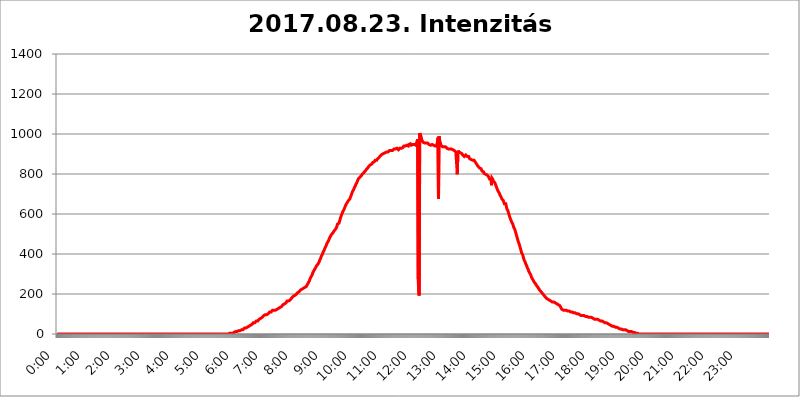
| Category | 2017.08.23. Intenzitás [W/m^2] |
|---|---|
| 0.0 | 0 |
| 0.0006944444444444445 | 0 |
| 0.001388888888888889 | 0 |
| 0.0020833333333333333 | 0 |
| 0.002777777777777778 | 0 |
| 0.003472222222222222 | 0 |
| 0.004166666666666667 | 0 |
| 0.004861111111111111 | 0 |
| 0.005555555555555556 | 0 |
| 0.0062499999999999995 | 0 |
| 0.006944444444444444 | 0 |
| 0.007638888888888889 | 0 |
| 0.008333333333333333 | 0 |
| 0.009027777777777779 | 0 |
| 0.009722222222222222 | 0 |
| 0.010416666666666666 | 0 |
| 0.011111111111111112 | 0 |
| 0.011805555555555555 | 0 |
| 0.012499999999999999 | 0 |
| 0.013194444444444444 | 0 |
| 0.013888888888888888 | 0 |
| 0.014583333333333332 | 0 |
| 0.015277777777777777 | 0 |
| 0.015972222222222224 | 0 |
| 0.016666666666666666 | 0 |
| 0.017361111111111112 | 0 |
| 0.018055555555555557 | 0 |
| 0.01875 | 0 |
| 0.019444444444444445 | 0 |
| 0.02013888888888889 | 0 |
| 0.020833333333333332 | 0 |
| 0.02152777777777778 | 0 |
| 0.022222222222222223 | 0 |
| 0.02291666666666667 | 0 |
| 0.02361111111111111 | 0 |
| 0.024305555555555556 | 0 |
| 0.024999999999999998 | 0 |
| 0.025694444444444447 | 0 |
| 0.02638888888888889 | 0 |
| 0.027083333333333334 | 0 |
| 0.027777777777777776 | 0 |
| 0.02847222222222222 | 0 |
| 0.029166666666666664 | 0 |
| 0.029861111111111113 | 0 |
| 0.030555555555555555 | 0 |
| 0.03125 | 0 |
| 0.03194444444444445 | 0 |
| 0.03263888888888889 | 0 |
| 0.03333333333333333 | 0 |
| 0.034027777777777775 | 0 |
| 0.034722222222222224 | 0 |
| 0.035416666666666666 | 0 |
| 0.036111111111111115 | 0 |
| 0.03680555555555556 | 0 |
| 0.0375 | 0 |
| 0.03819444444444444 | 0 |
| 0.03888888888888889 | 0 |
| 0.03958333333333333 | 0 |
| 0.04027777777777778 | 0 |
| 0.04097222222222222 | 0 |
| 0.041666666666666664 | 0 |
| 0.042361111111111106 | 0 |
| 0.04305555555555556 | 0 |
| 0.043750000000000004 | 0 |
| 0.044444444444444446 | 0 |
| 0.04513888888888889 | 0 |
| 0.04583333333333334 | 0 |
| 0.04652777777777778 | 0 |
| 0.04722222222222222 | 0 |
| 0.04791666666666666 | 0 |
| 0.04861111111111111 | 0 |
| 0.049305555555555554 | 0 |
| 0.049999999999999996 | 0 |
| 0.05069444444444445 | 0 |
| 0.051388888888888894 | 0 |
| 0.052083333333333336 | 0 |
| 0.05277777777777778 | 0 |
| 0.05347222222222222 | 0 |
| 0.05416666666666667 | 0 |
| 0.05486111111111111 | 0 |
| 0.05555555555555555 | 0 |
| 0.05625 | 0 |
| 0.05694444444444444 | 0 |
| 0.057638888888888885 | 0 |
| 0.05833333333333333 | 0 |
| 0.05902777777777778 | 0 |
| 0.059722222222222225 | 0 |
| 0.06041666666666667 | 0 |
| 0.061111111111111116 | 0 |
| 0.06180555555555556 | 0 |
| 0.0625 | 0 |
| 0.06319444444444444 | 0 |
| 0.06388888888888888 | 0 |
| 0.06458333333333334 | 0 |
| 0.06527777777777778 | 0 |
| 0.06597222222222222 | 0 |
| 0.06666666666666667 | 0 |
| 0.06736111111111111 | 0 |
| 0.06805555555555555 | 0 |
| 0.06874999999999999 | 0 |
| 0.06944444444444443 | 0 |
| 0.07013888888888889 | 0 |
| 0.07083333333333333 | 0 |
| 0.07152777777777779 | 0 |
| 0.07222222222222223 | 0 |
| 0.07291666666666667 | 0 |
| 0.07361111111111111 | 0 |
| 0.07430555555555556 | 0 |
| 0.075 | 0 |
| 0.07569444444444444 | 0 |
| 0.0763888888888889 | 0 |
| 0.07708333333333334 | 0 |
| 0.07777777777777778 | 0 |
| 0.07847222222222222 | 0 |
| 0.07916666666666666 | 0 |
| 0.0798611111111111 | 0 |
| 0.08055555555555556 | 0 |
| 0.08125 | 0 |
| 0.08194444444444444 | 0 |
| 0.08263888888888889 | 0 |
| 0.08333333333333333 | 0 |
| 0.08402777777777777 | 0 |
| 0.08472222222222221 | 0 |
| 0.08541666666666665 | 0 |
| 0.08611111111111112 | 0 |
| 0.08680555555555557 | 0 |
| 0.08750000000000001 | 0 |
| 0.08819444444444445 | 0 |
| 0.08888888888888889 | 0 |
| 0.08958333333333333 | 0 |
| 0.09027777777777778 | 0 |
| 0.09097222222222222 | 0 |
| 0.09166666666666667 | 0 |
| 0.09236111111111112 | 0 |
| 0.09305555555555556 | 0 |
| 0.09375 | 0 |
| 0.09444444444444444 | 0 |
| 0.09513888888888888 | 0 |
| 0.09583333333333333 | 0 |
| 0.09652777777777777 | 0 |
| 0.09722222222222222 | 0 |
| 0.09791666666666667 | 0 |
| 0.09861111111111111 | 0 |
| 0.09930555555555555 | 0 |
| 0.09999999999999999 | 0 |
| 0.10069444444444443 | 0 |
| 0.1013888888888889 | 0 |
| 0.10208333333333335 | 0 |
| 0.10277777777777779 | 0 |
| 0.10347222222222223 | 0 |
| 0.10416666666666667 | 0 |
| 0.10486111111111111 | 0 |
| 0.10555555555555556 | 0 |
| 0.10625 | 0 |
| 0.10694444444444444 | 0 |
| 0.1076388888888889 | 0 |
| 0.10833333333333334 | 0 |
| 0.10902777777777778 | 0 |
| 0.10972222222222222 | 0 |
| 0.1111111111111111 | 0 |
| 0.11180555555555556 | 0 |
| 0.11180555555555556 | 0 |
| 0.1125 | 0 |
| 0.11319444444444444 | 0 |
| 0.11388888888888889 | 0 |
| 0.11458333333333333 | 0 |
| 0.11527777777777777 | 0 |
| 0.11597222222222221 | 0 |
| 0.11666666666666665 | 0 |
| 0.1173611111111111 | 0 |
| 0.11805555555555557 | 0 |
| 0.11944444444444445 | 0 |
| 0.12013888888888889 | 0 |
| 0.12083333333333333 | 0 |
| 0.12152777777777778 | 0 |
| 0.12222222222222223 | 0 |
| 0.12291666666666667 | 0 |
| 0.12291666666666667 | 0 |
| 0.12361111111111112 | 0 |
| 0.12430555555555556 | 0 |
| 0.125 | 0 |
| 0.12569444444444444 | 0 |
| 0.12638888888888888 | 0 |
| 0.12708333333333333 | 0 |
| 0.16875 | 0 |
| 0.12847222222222224 | 0 |
| 0.12916666666666668 | 0 |
| 0.12986111111111112 | 0 |
| 0.13055555555555556 | 0 |
| 0.13125 | 0 |
| 0.13194444444444445 | 0 |
| 0.1326388888888889 | 0 |
| 0.13333333333333333 | 0 |
| 0.13402777777777777 | 0 |
| 0.13402777777777777 | 0 |
| 0.13472222222222222 | 0 |
| 0.13541666666666666 | 0 |
| 0.1361111111111111 | 0 |
| 0.13749999999999998 | 0 |
| 0.13819444444444443 | 0 |
| 0.1388888888888889 | 0 |
| 0.13958333333333334 | 0 |
| 0.14027777777777778 | 0 |
| 0.14097222222222222 | 0 |
| 0.14166666666666666 | 0 |
| 0.1423611111111111 | 0 |
| 0.14305555555555557 | 0 |
| 0.14375000000000002 | 0 |
| 0.14444444444444446 | 0 |
| 0.1451388888888889 | 0 |
| 0.1451388888888889 | 0 |
| 0.14652777777777778 | 0 |
| 0.14722222222222223 | 0 |
| 0.14791666666666667 | 0 |
| 0.1486111111111111 | 0 |
| 0.14930555555555555 | 0 |
| 0.15 | 0 |
| 0.15069444444444444 | 0 |
| 0.15138888888888888 | 0 |
| 0.15208333333333332 | 0 |
| 0.15277777777777776 | 0 |
| 0.15347222222222223 | 0 |
| 0.15416666666666667 | 0 |
| 0.15486111111111112 | 0 |
| 0.15555555555555556 | 0 |
| 0.15625 | 0 |
| 0.15694444444444444 | 0 |
| 0.15763888888888888 | 0 |
| 0.15833333333333333 | 0 |
| 0.15902777777777777 | 0 |
| 0.15972222222222224 | 0 |
| 0.16041666666666668 | 0 |
| 0.16111111111111112 | 0 |
| 0.16180555555555556 | 0 |
| 0.1625 | 0 |
| 0.16319444444444445 | 0 |
| 0.1638888888888889 | 0 |
| 0.16458333333333333 | 0 |
| 0.16527777777777777 | 0 |
| 0.16597222222222222 | 0 |
| 0.16666666666666666 | 0 |
| 0.1673611111111111 | 0 |
| 0.16805555555555554 | 0 |
| 0.16874999999999998 | 0 |
| 0.16944444444444443 | 0 |
| 0.17013888888888887 | 0 |
| 0.1708333333333333 | 0 |
| 0.17152777777777775 | 0 |
| 0.17222222222222225 | 0 |
| 0.1729166666666667 | 0 |
| 0.17361111111111113 | 0 |
| 0.17430555555555557 | 0 |
| 0.17500000000000002 | 0 |
| 0.17569444444444446 | 0 |
| 0.1763888888888889 | 0 |
| 0.17708333333333334 | 0 |
| 0.17777777777777778 | 0 |
| 0.17847222222222223 | 0 |
| 0.17916666666666667 | 0 |
| 0.1798611111111111 | 0 |
| 0.18055555555555555 | 0 |
| 0.18125 | 0 |
| 0.18194444444444444 | 0 |
| 0.1826388888888889 | 0 |
| 0.18333333333333335 | 0 |
| 0.1840277777777778 | 0 |
| 0.18472222222222223 | 0 |
| 0.18541666666666667 | 0 |
| 0.18611111111111112 | 0 |
| 0.18680555555555556 | 0 |
| 0.1875 | 0 |
| 0.18819444444444444 | 0 |
| 0.18888888888888888 | 0 |
| 0.18958333333333333 | 0 |
| 0.19027777777777777 | 0 |
| 0.1909722222222222 | 0 |
| 0.19166666666666665 | 0 |
| 0.19236111111111112 | 0 |
| 0.19305555555555554 | 0 |
| 0.19375 | 0 |
| 0.19444444444444445 | 0 |
| 0.1951388888888889 | 0 |
| 0.19583333333333333 | 0 |
| 0.19652777777777777 | 0 |
| 0.19722222222222222 | 0 |
| 0.19791666666666666 | 0 |
| 0.1986111111111111 | 0 |
| 0.19930555555555554 | 0 |
| 0.19999999999999998 | 0 |
| 0.20069444444444443 | 0 |
| 0.20138888888888887 | 0 |
| 0.2020833333333333 | 0 |
| 0.2027777777777778 | 0 |
| 0.2034722222222222 | 0 |
| 0.2041666666666667 | 0 |
| 0.20486111111111113 | 0 |
| 0.20555555555555557 | 0 |
| 0.20625000000000002 | 0 |
| 0.20694444444444446 | 0 |
| 0.2076388888888889 | 0 |
| 0.20833333333333334 | 0 |
| 0.20902777777777778 | 0 |
| 0.20972222222222223 | 0 |
| 0.21041666666666667 | 0 |
| 0.2111111111111111 | 0 |
| 0.21180555555555555 | 0 |
| 0.2125 | 0 |
| 0.21319444444444444 | 0 |
| 0.2138888888888889 | 0 |
| 0.21458333333333335 | 0 |
| 0.2152777777777778 | 0 |
| 0.21597222222222223 | 0 |
| 0.21666666666666667 | 0 |
| 0.21736111111111112 | 0 |
| 0.21805555555555556 | 0 |
| 0.21875 | 0 |
| 0.21944444444444444 | 0 |
| 0.22013888888888888 | 0 |
| 0.22083333333333333 | 0 |
| 0.22152777777777777 | 0 |
| 0.2222222222222222 | 0 |
| 0.22291666666666665 | 0 |
| 0.2236111111111111 | 0 |
| 0.22430555555555556 | 0 |
| 0.225 | 0 |
| 0.22569444444444445 | 0 |
| 0.2263888888888889 | 0 |
| 0.22708333333333333 | 0 |
| 0.22777777777777777 | 0 |
| 0.22847222222222222 | 0 |
| 0.22916666666666666 | 0 |
| 0.2298611111111111 | 0 |
| 0.23055555555555554 | 0 |
| 0.23124999999999998 | 0 |
| 0.23194444444444443 | 0 |
| 0.23263888888888887 | 0 |
| 0.2333333333333333 | 0 |
| 0.2340277777777778 | 0 |
| 0.2347222222222222 | 0 |
| 0.2354166666666667 | 0 |
| 0.23611111111111113 | 0 |
| 0.23680555555555557 | 0 |
| 0.23750000000000002 | 0 |
| 0.23819444444444446 | 0 |
| 0.2388888888888889 | 0 |
| 0.23958333333333334 | 0 |
| 0.24027777777777778 | 3.525 |
| 0.24097222222222223 | 3.525 |
| 0.24166666666666667 | 3.525 |
| 0.2423611111111111 | 3.525 |
| 0.24305555555555555 | 3.525 |
| 0.24375 | 3.525 |
| 0.24444444444444446 | 3.525 |
| 0.24513888888888888 | 3.525 |
| 0.24583333333333335 | 3.525 |
| 0.2465277777777778 | 7.887 |
| 0.24722222222222223 | 7.887 |
| 0.24791666666666667 | 7.887 |
| 0.24861111111111112 | 7.887 |
| 0.24930555555555556 | 7.887 |
| 0.25 | 12.257 |
| 0.25069444444444444 | 12.257 |
| 0.2513888888888889 | 12.257 |
| 0.2520833333333333 | 12.257 |
| 0.25277777777777777 | 12.257 |
| 0.2534722222222222 | 16.636 |
| 0.25416666666666665 | 16.636 |
| 0.2548611111111111 | 16.636 |
| 0.2555555555555556 | 16.636 |
| 0.25625000000000003 | 16.636 |
| 0.2569444444444445 | 16.636 |
| 0.2576388888888889 | 21.024 |
| 0.25833333333333336 | 21.024 |
| 0.2590277777777778 | 21.024 |
| 0.25972222222222224 | 21.024 |
| 0.2604166666666667 | 21.024 |
| 0.2611111111111111 | 25.419 |
| 0.26180555555555557 | 25.419 |
| 0.2625 | 29.823 |
| 0.26319444444444445 | 29.823 |
| 0.2638888888888889 | 29.823 |
| 0.26458333333333334 | 29.823 |
| 0.2652777777777778 | 34.234 |
| 0.2659722222222222 | 34.234 |
| 0.26666666666666666 | 34.234 |
| 0.2673611111111111 | 38.653 |
| 0.26805555555555555 | 38.653 |
| 0.26875 | 38.653 |
| 0.26944444444444443 | 43.079 |
| 0.2701388888888889 | 43.079 |
| 0.2708333333333333 | 43.079 |
| 0.27152777777777776 | 47.511 |
| 0.2722222222222222 | 47.511 |
| 0.27291666666666664 | 47.511 |
| 0.2736111111111111 | 51.951 |
| 0.2743055555555555 | 51.951 |
| 0.27499999999999997 | 56.398 |
| 0.27569444444444446 | 56.398 |
| 0.27638888888888885 | 56.398 |
| 0.27708333333333335 | 56.398 |
| 0.2777777777777778 | 56.398 |
| 0.27847222222222223 | 60.85 |
| 0.2791666666666667 | 65.31 |
| 0.2798611111111111 | 60.85 |
| 0.28055555555555556 | 60.85 |
| 0.28125 | 65.31 |
| 0.28194444444444444 | 65.31 |
| 0.2826388888888889 | 69.775 |
| 0.2833333333333333 | 74.246 |
| 0.28402777777777777 | 74.246 |
| 0.2847222222222222 | 74.246 |
| 0.28541666666666665 | 78.722 |
| 0.28611111111111115 | 78.722 |
| 0.28680555555555554 | 83.205 |
| 0.28750000000000003 | 83.205 |
| 0.2881944444444445 | 83.205 |
| 0.2888888888888889 | 87.692 |
| 0.28958333333333336 | 92.184 |
| 0.2902777777777778 | 92.184 |
| 0.29097222222222224 | 92.184 |
| 0.2916666666666667 | 96.682 |
| 0.2923611111111111 | 96.682 |
| 0.29305555555555557 | 96.682 |
| 0.29375 | 96.682 |
| 0.29444444444444445 | 101.184 |
| 0.2951388888888889 | 101.184 |
| 0.29583333333333334 | 101.184 |
| 0.2965277777777778 | 105.69 |
| 0.2972222222222222 | 105.69 |
| 0.29791666666666666 | 110.201 |
| 0.2986111111111111 | 110.201 |
| 0.29930555555555555 | 110.201 |
| 0.3 | 110.201 |
| 0.30069444444444443 | 114.716 |
| 0.3013888888888889 | 114.716 |
| 0.3020833333333333 | 119.235 |
| 0.30277777777777776 | 119.235 |
| 0.3034722222222222 | 119.235 |
| 0.30416666666666664 | 119.235 |
| 0.3048611111111111 | 119.235 |
| 0.3055555555555555 | 119.235 |
| 0.30624999999999997 | 119.235 |
| 0.3069444444444444 | 123.758 |
| 0.3076388888888889 | 123.758 |
| 0.30833333333333335 | 123.758 |
| 0.3090277777777778 | 128.284 |
| 0.30972222222222223 | 128.284 |
| 0.3104166666666667 | 128.284 |
| 0.3111111111111111 | 132.814 |
| 0.31180555555555556 | 132.814 |
| 0.3125 | 132.814 |
| 0.31319444444444444 | 137.347 |
| 0.3138888888888889 | 137.347 |
| 0.3145833333333333 | 137.347 |
| 0.31527777777777777 | 141.884 |
| 0.3159722222222222 | 141.884 |
| 0.31666666666666665 | 146.423 |
| 0.31736111111111115 | 146.423 |
| 0.31805555555555554 | 150.964 |
| 0.31875000000000003 | 150.964 |
| 0.3194444444444445 | 155.509 |
| 0.3201388888888889 | 155.509 |
| 0.32083333333333336 | 155.509 |
| 0.3215277777777778 | 160.056 |
| 0.32222222222222224 | 164.605 |
| 0.3229166666666667 | 164.605 |
| 0.3236111111111111 | 164.605 |
| 0.32430555555555557 | 164.605 |
| 0.325 | 164.605 |
| 0.32569444444444445 | 169.156 |
| 0.3263888888888889 | 169.156 |
| 0.32708333333333334 | 173.709 |
| 0.3277777777777778 | 173.709 |
| 0.3284722222222222 | 178.264 |
| 0.32916666666666666 | 178.264 |
| 0.3298611111111111 | 182.82 |
| 0.33055555555555555 | 187.378 |
| 0.33125 | 187.378 |
| 0.33194444444444443 | 191.937 |
| 0.3326388888888889 | 191.937 |
| 0.3333333333333333 | 191.937 |
| 0.3340277777777778 | 196.497 |
| 0.3347222222222222 | 196.497 |
| 0.3354166666666667 | 201.058 |
| 0.3361111111111111 | 201.058 |
| 0.3368055555555556 | 205.62 |
| 0.33749999999999997 | 210.182 |
| 0.33819444444444446 | 210.182 |
| 0.33888888888888885 | 210.182 |
| 0.33958333333333335 | 214.746 |
| 0.34027777777777773 | 214.746 |
| 0.34097222222222223 | 219.309 |
| 0.3416666666666666 | 219.309 |
| 0.3423611111111111 | 219.309 |
| 0.3430555555555555 | 223.873 |
| 0.34375 | 223.873 |
| 0.3444444444444445 | 228.436 |
| 0.3451388888888889 | 228.436 |
| 0.3458333333333334 | 233 |
| 0.34652777777777777 | 233 |
| 0.34722222222222227 | 233 |
| 0.34791666666666665 | 233 |
| 0.34861111111111115 | 237.564 |
| 0.34930555555555554 | 237.564 |
| 0.35000000000000003 | 242.127 |
| 0.3506944444444444 | 246.689 |
| 0.3513888888888889 | 251.251 |
| 0.3520833333333333 | 255.813 |
| 0.3527777777777778 | 260.373 |
| 0.3534722222222222 | 264.932 |
| 0.3541666666666667 | 269.49 |
| 0.3548611111111111 | 278.603 |
| 0.35555555555555557 | 283.156 |
| 0.35625 | 287.709 |
| 0.35694444444444445 | 292.259 |
| 0.3576388888888889 | 296.808 |
| 0.35833333333333334 | 305.898 |
| 0.3590277777777778 | 305.898 |
| 0.3597222222222222 | 314.98 |
| 0.36041666666666666 | 314.98 |
| 0.3611111111111111 | 324.052 |
| 0.36180555555555555 | 324.052 |
| 0.3625 | 333.113 |
| 0.36319444444444443 | 337.639 |
| 0.3638888888888889 | 342.162 |
| 0.3645833333333333 | 342.162 |
| 0.3652777777777778 | 346.682 |
| 0.3659722222222222 | 351.198 |
| 0.3666666666666667 | 355.712 |
| 0.3673611111111111 | 360.221 |
| 0.3680555555555556 | 369.23 |
| 0.36874999999999997 | 373.729 |
| 0.36944444444444446 | 378.224 |
| 0.37013888888888885 | 387.202 |
| 0.37083333333333335 | 391.685 |
| 0.37152777777777773 | 396.164 |
| 0.37222222222222223 | 400.638 |
| 0.3729166666666666 | 409.574 |
| 0.3736111111111111 | 414.035 |
| 0.3743055555555555 | 418.492 |
| 0.375 | 422.943 |
| 0.3756944444444445 | 431.833 |
| 0.3763888888888889 | 436.27 |
| 0.3770833333333334 | 440.702 |
| 0.37777777777777777 | 449.551 |
| 0.37847222222222227 | 453.968 |
| 0.37916666666666665 | 458.38 |
| 0.37986111111111115 | 462.786 |
| 0.38055555555555554 | 467.187 |
| 0.38125000000000003 | 471.582 |
| 0.3819444444444444 | 480.356 |
| 0.3826388888888889 | 484.735 |
| 0.3833333333333333 | 489.108 |
| 0.3840277777777778 | 493.475 |
| 0.3847222222222222 | 497.836 |
| 0.3854166666666667 | 502.192 |
| 0.3861111111111111 | 502.192 |
| 0.38680555555555557 | 506.542 |
| 0.3875 | 510.885 |
| 0.38819444444444445 | 515.223 |
| 0.3888888888888889 | 515.223 |
| 0.38958333333333334 | 519.555 |
| 0.3902777777777778 | 523.88 |
| 0.3909722222222222 | 528.2 |
| 0.39166666666666666 | 532.513 |
| 0.3923611111111111 | 541.121 |
| 0.39305555555555555 | 549.704 |
| 0.39375 | 549.704 |
| 0.39444444444444443 | 553.986 |
| 0.3951388888888889 | 553.986 |
| 0.3958333333333333 | 562.53 |
| 0.3965277777777778 | 571.049 |
| 0.3972222222222222 | 579.542 |
| 0.3979166666666667 | 588.009 |
| 0.3986111111111111 | 592.233 |
| 0.3993055555555556 | 600.661 |
| 0.39999999999999997 | 604.864 |
| 0.40069444444444446 | 613.252 |
| 0.40138888888888885 | 613.252 |
| 0.40208333333333335 | 621.613 |
| 0.40277777777777773 | 625.784 |
| 0.40347222222222223 | 634.105 |
| 0.4041666666666666 | 638.256 |
| 0.4048611111111111 | 646.537 |
| 0.4055555555555555 | 646.537 |
| 0.40625 | 650.667 |
| 0.4069444444444445 | 658.909 |
| 0.4076388888888889 | 663.019 |
| 0.4083333333333334 | 667.123 |
| 0.40902777777777777 | 667.123 |
| 0.40972222222222227 | 667.123 |
| 0.41041666666666665 | 675.311 |
| 0.41111111111111115 | 683.473 |
| 0.41180555555555554 | 687.544 |
| 0.41250000000000003 | 695.666 |
| 0.4131944444444444 | 703.762 |
| 0.4138888888888889 | 707.8 |
| 0.4145833333333333 | 715.858 |
| 0.4152777777777778 | 719.877 |
| 0.4159722222222222 | 723.889 |
| 0.4166666666666667 | 731.896 |
| 0.4173611111111111 | 735.89 |
| 0.41805555555555557 | 739.877 |
| 0.41875 | 747.834 |
| 0.41944444444444445 | 751.803 |
| 0.4201388888888889 | 755.766 |
| 0.42083333333333334 | 763.674 |
| 0.4215277777777778 | 767.62 |
| 0.4222222222222222 | 775.492 |
| 0.42291666666666666 | 779.42 |
| 0.4236111111111111 | 779.42 |
| 0.42430555555555555 | 783.342 |
| 0.425 | 783.342 |
| 0.42569444444444443 | 787.258 |
| 0.4263888888888889 | 791.169 |
| 0.4270833333333333 | 795.074 |
| 0.4277777777777778 | 798.974 |
| 0.4284722222222222 | 802.868 |
| 0.4291666666666667 | 802.868 |
| 0.4298611111111111 | 806.757 |
| 0.4305555555555556 | 806.757 |
| 0.43124999999999997 | 810.641 |
| 0.43194444444444446 | 814.519 |
| 0.43263888888888885 | 818.392 |
| 0.43333333333333335 | 822.26 |
| 0.43402777777777773 | 826.123 |
| 0.43472222222222223 | 826.123 |
| 0.4354166666666666 | 829.981 |
| 0.4361111111111111 | 833.834 |
| 0.4368055555555555 | 837.682 |
| 0.4375 | 837.682 |
| 0.4381944444444445 | 841.526 |
| 0.4388888888888889 | 845.365 |
| 0.4395833333333334 | 845.365 |
| 0.44027777777777777 | 845.365 |
| 0.44097222222222227 | 849.199 |
| 0.44166666666666665 | 853.029 |
| 0.44236111111111115 | 856.855 |
| 0.44305555555555554 | 856.855 |
| 0.44375000000000003 | 856.855 |
| 0.4444444444444444 | 860.676 |
| 0.4451388888888889 | 860.676 |
| 0.4458333333333333 | 868.305 |
| 0.4465277777777778 | 868.305 |
| 0.4472222222222222 | 868.305 |
| 0.4479166666666667 | 868.305 |
| 0.4486111111111111 | 868.305 |
| 0.44930555555555557 | 875.918 |
| 0.45 | 875.918 |
| 0.45069444444444445 | 879.719 |
| 0.4513888888888889 | 883.516 |
| 0.45208333333333334 | 883.516 |
| 0.4527777777777778 | 887.309 |
| 0.4534722222222222 | 891.099 |
| 0.45416666666666666 | 894.885 |
| 0.4548611111111111 | 894.885 |
| 0.45555555555555555 | 898.668 |
| 0.45625 | 902.447 |
| 0.45694444444444443 | 902.447 |
| 0.4576388888888889 | 902.447 |
| 0.4583333333333333 | 902.447 |
| 0.4590277777777778 | 906.223 |
| 0.4597222222222222 | 906.223 |
| 0.4604166666666667 | 906.223 |
| 0.4611111111111111 | 909.996 |
| 0.4618055555555556 | 909.996 |
| 0.46249999999999997 | 909.996 |
| 0.46319444444444446 | 909.996 |
| 0.46388888888888885 | 909.996 |
| 0.46458333333333335 | 909.996 |
| 0.46527777777777773 | 913.766 |
| 0.46597222222222223 | 917.534 |
| 0.4666666666666666 | 917.534 |
| 0.4673611111111111 | 913.766 |
| 0.4680555555555555 | 917.534 |
| 0.46875 | 917.534 |
| 0.4694444444444445 | 917.534 |
| 0.4701388888888889 | 917.534 |
| 0.4708333333333334 | 921.298 |
| 0.47152777777777777 | 917.534 |
| 0.47222222222222227 | 925.06 |
| 0.47291666666666665 | 925.06 |
| 0.47361111111111115 | 925.06 |
| 0.47430555555555554 | 925.06 |
| 0.47500000000000003 | 925.06 |
| 0.4756944444444444 | 928.819 |
| 0.4763888888888889 | 928.819 |
| 0.4770833333333333 | 925.06 |
| 0.4777777777777778 | 925.06 |
| 0.4784722222222222 | 921.298 |
| 0.4791666666666667 | 925.06 |
| 0.4798611111111111 | 925.06 |
| 0.48055555555555557 | 928.819 |
| 0.48125 | 932.576 |
| 0.48194444444444445 | 928.819 |
| 0.4826388888888889 | 928.819 |
| 0.48333333333333334 | 928.819 |
| 0.4840277777777778 | 932.576 |
| 0.4847222222222222 | 932.576 |
| 0.48541666666666666 | 936.33 |
| 0.4861111111111111 | 940.082 |
| 0.48680555555555555 | 940.082 |
| 0.4875 | 940.082 |
| 0.48819444444444443 | 940.082 |
| 0.4888888888888889 | 940.082 |
| 0.4895833333333333 | 940.082 |
| 0.4902777777777778 | 943.832 |
| 0.4909722222222222 | 943.832 |
| 0.4916666666666667 | 940.082 |
| 0.4923611111111111 | 940.082 |
| 0.4930555555555556 | 947.58 |
| 0.49374999999999997 | 947.58 |
| 0.49444444444444446 | 947.58 |
| 0.49513888888888885 | 951.327 |
| 0.49583333333333335 | 947.58 |
| 0.49652777777777773 | 943.832 |
| 0.49722222222222223 | 943.832 |
| 0.4979166666666666 | 947.58 |
| 0.4986111111111111 | 947.58 |
| 0.4993055555555555 | 947.58 |
| 0.5 | 947.58 |
| 0.5006944444444444 | 947.58 |
| 0.5013888888888889 | 943.832 |
| 0.5020833333333333 | 943.832 |
| 0.5027777777777778 | 943.832 |
| 0.5034722222222222 | 951.327 |
| 0.5041666666666667 | 947.58 |
| 0.5048611111111111 | 951.327 |
| 0.5055555555555555 | 973.772 |
| 0.50625 | 274.047 |
| 0.5069444444444444 | 210.182 |
| 0.5076388888888889 | 191.937 |
| 0.5083333333333333 | 1003.65 |
| 0.5090277777777777 | 999.916 |
| 0.5097222222222222 | 992.448 |
| 0.5104166666666666 | 984.98 |
| 0.5111111111111112 | 973.772 |
| 0.5118055555555555 | 966.295 |
| 0.5125000000000001 | 962.555 |
| 0.5131944444444444 | 958.814 |
| 0.513888888888889 | 958.814 |
| 0.5145833333333333 | 955.071 |
| 0.5152777777777778 | 955.071 |
| 0.5159722222222222 | 951.327 |
| 0.5166666666666667 | 955.071 |
| 0.517361111111111 | 955.071 |
| 0.5180555555555556 | 955.071 |
| 0.5187499999999999 | 955.071 |
| 0.5194444444444445 | 955.071 |
| 0.5201388888888888 | 955.071 |
| 0.5208333333333334 | 951.327 |
| 0.5215277777777778 | 947.58 |
| 0.5222222222222223 | 947.58 |
| 0.5229166666666667 | 943.832 |
| 0.5236111111111111 | 943.832 |
| 0.5243055555555556 | 943.832 |
| 0.525 | 943.832 |
| 0.5256944444444445 | 947.58 |
| 0.5263888888888889 | 947.58 |
| 0.5270833333333333 | 947.58 |
| 0.5277777777777778 | 943.832 |
| 0.5284722222222222 | 943.832 |
| 0.5291666666666667 | 940.082 |
| 0.5298611111111111 | 940.082 |
| 0.5305555555555556 | 940.082 |
| 0.53125 | 940.082 |
| 0.5319444444444444 | 940.082 |
| 0.5326388888888889 | 940.082 |
| 0.5333333333333333 | 962.555 |
| 0.5340277777777778 | 981.244 |
| 0.5347222222222222 | 675.311 |
| 0.5354166666666667 | 988.714 |
| 0.5361111111111111 | 973.772 |
| 0.5368055555555555 | 962.555 |
| 0.5375 | 955.071 |
| 0.5381944444444444 | 943.832 |
| 0.5388888888888889 | 940.082 |
| 0.5395833333333333 | 943.832 |
| 0.5402777777777777 | 936.33 |
| 0.5409722222222222 | 940.082 |
| 0.5416666666666666 | 940.082 |
| 0.5423611111111112 | 936.33 |
| 0.5430555555555555 | 936.33 |
| 0.5437500000000001 | 936.33 |
| 0.5444444444444444 | 936.33 |
| 0.545138888888889 | 936.33 |
| 0.5458333333333333 | 932.576 |
| 0.5465277777777778 | 928.819 |
| 0.5472222222222222 | 925.06 |
| 0.5479166666666667 | 925.06 |
| 0.548611111111111 | 925.06 |
| 0.5493055555555556 | 925.06 |
| 0.5499999999999999 | 925.06 |
| 0.5506944444444445 | 925.06 |
| 0.5513888888888888 | 925.06 |
| 0.5520833333333334 | 925.06 |
| 0.5527777777777778 | 925.06 |
| 0.5534722222222223 | 925.06 |
| 0.5541666666666667 | 921.298 |
| 0.5548611111111111 | 921.298 |
| 0.5555555555555556 | 917.534 |
| 0.55625 | 917.534 |
| 0.5569444444444445 | 917.534 |
| 0.5576388888888889 | 917.534 |
| 0.5583333333333333 | 913.766 |
| 0.5590277777777778 | 909.996 |
| 0.5597222222222222 | 909.996 |
| 0.5604166666666667 | 909.996 |
| 0.5611111111111111 | 798.974 |
| 0.5618055555555556 | 898.668 |
| 0.5625 | 917.534 |
| 0.5631944444444444 | 909.996 |
| 0.5638888888888889 | 909.996 |
| 0.5645833333333333 | 906.223 |
| 0.5652777777777778 | 906.223 |
| 0.5659722222222222 | 906.223 |
| 0.5666666666666667 | 902.447 |
| 0.5673611111111111 | 902.447 |
| 0.5680555555555555 | 898.668 |
| 0.56875 | 894.885 |
| 0.5694444444444444 | 894.885 |
| 0.5701388888888889 | 891.099 |
| 0.5708333333333333 | 887.309 |
| 0.5715277777777777 | 891.099 |
| 0.5722222222222222 | 891.099 |
| 0.5729166666666666 | 894.885 |
| 0.5736111111111112 | 891.099 |
| 0.5743055555555555 | 891.099 |
| 0.5750000000000001 | 887.309 |
| 0.5756944444444444 | 887.309 |
| 0.576388888888889 | 887.309 |
| 0.5770833333333333 | 887.309 |
| 0.5777777777777778 | 883.516 |
| 0.5784722222222222 | 875.918 |
| 0.5791666666666667 | 875.918 |
| 0.579861111111111 | 872.114 |
| 0.5805555555555556 | 872.114 |
| 0.5812499999999999 | 872.114 |
| 0.5819444444444445 | 872.114 |
| 0.5826388888888888 | 868.305 |
| 0.5833333333333334 | 868.305 |
| 0.5840277777777778 | 864.493 |
| 0.5847222222222223 | 868.305 |
| 0.5854166666666667 | 864.493 |
| 0.5861111111111111 | 860.676 |
| 0.5868055555555556 | 856.855 |
| 0.5875 | 853.029 |
| 0.5881944444444445 | 849.199 |
| 0.5888888888888889 | 845.365 |
| 0.5895833333333333 | 841.526 |
| 0.5902777777777778 | 837.682 |
| 0.5909722222222222 | 837.682 |
| 0.5916666666666667 | 833.834 |
| 0.5923611111111111 | 829.981 |
| 0.5930555555555556 | 826.123 |
| 0.59375 | 826.123 |
| 0.5944444444444444 | 826.123 |
| 0.5951388888888889 | 822.26 |
| 0.5958333333333333 | 814.519 |
| 0.5965277777777778 | 814.519 |
| 0.5972222222222222 | 814.519 |
| 0.5979166666666667 | 810.641 |
| 0.5986111111111111 | 802.868 |
| 0.5993055555555555 | 802.868 |
| 0.6 | 798.974 |
| 0.6006944444444444 | 798.974 |
| 0.6013888888888889 | 798.974 |
| 0.6020833333333333 | 798.974 |
| 0.6027777777777777 | 795.074 |
| 0.6034722222222222 | 791.169 |
| 0.6041666666666666 | 791.169 |
| 0.6048611111111112 | 787.258 |
| 0.6055555555555555 | 783.342 |
| 0.6062500000000001 | 775.492 |
| 0.6069444444444444 | 775.492 |
| 0.607638888888889 | 771.559 |
| 0.6083333333333333 | 775.492 |
| 0.6090277777777778 | 743.859 |
| 0.6097222222222222 | 779.42 |
| 0.6104166666666667 | 779.42 |
| 0.611111111111111 | 771.559 |
| 0.6118055555555556 | 763.674 |
| 0.6124999999999999 | 763.674 |
| 0.6131944444444445 | 759.723 |
| 0.6138888888888888 | 755.766 |
| 0.6145833333333334 | 747.834 |
| 0.6152777777777778 | 743.859 |
| 0.6159722222222223 | 735.89 |
| 0.6166666666666667 | 727.896 |
| 0.6173611111111111 | 723.889 |
| 0.6180555555555556 | 715.858 |
| 0.61875 | 711.832 |
| 0.6194444444444445 | 711.832 |
| 0.6201388888888889 | 703.762 |
| 0.6208333333333333 | 695.666 |
| 0.6215277777777778 | 691.608 |
| 0.6222222222222222 | 687.544 |
| 0.6229166666666667 | 683.473 |
| 0.6236111111111111 | 675.311 |
| 0.6243055555555556 | 675.311 |
| 0.625 | 671.22 |
| 0.6256944444444444 | 667.123 |
| 0.6263888888888889 | 658.909 |
| 0.6270833333333333 | 650.667 |
| 0.6277777777777778 | 650.667 |
| 0.6284722222222222 | 646.537 |
| 0.6291666666666667 | 650.667 |
| 0.6298611111111111 | 638.256 |
| 0.6305555555555555 | 625.784 |
| 0.63125 | 621.613 |
| 0.6319444444444444 | 617.436 |
| 0.6326388888888889 | 609.062 |
| 0.6333333333333333 | 600.661 |
| 0.6340277777777777 | 592.233 |
| 0.6347222222222222 | 583.779 |
| 0.6354166666666666 | 579.542 |
| 0.6361111111111112 | 571.049 |
| 0.6368055555555555 | 566.793 |
| 0.6375000000000001 | 558.261 |
| 0.6381944444444444 | 553.986 |
| 0.638888888888889 | 549.704 |
| 0.6395833333333333 | 541.121 |
| 0.6402777777777778 | 532.513 |
| 0.6409722222222222 | 528.2 |
| 0.6416666666666667 | 523.88 |
| 0.642361111111111 | 515.223 |
| 0.6430555555555556 | 506.542 |
| 0.6437499999999999 | 497.836 |
| 0.6444444444444445 | 489.108 |
| 0.6451388888888888 | 480.356 |
| 0.6458333333333334 | 471.582 |
| 0.6465277777777778 | 462.786 |
| 0.6472222222222223 | 458.38 |
| 0.6479166666666667 | 449.551 |
| 0.6486111111111111 | 440.702 |
| 0.6493055555555556 | 431.833 |
| 0.65 | 422.943 |
| 0.6506944444444445 | 414.035 |
| 0.6513888888888889 | 405.108 |
| 0.6520833333333333 | 400.638 |
| 0.6527777777777778 | 396.164 |
| 0.6534722222222222 | 387.202 |
| 0.6541666666666667 | 378.224 |
| 0.6548611111111111 | 369.23 |
| 0.6555555555555556 | 364.728 |
| 0.65625 | 360.221 |
| 0.6569444444444444 | 351.198 |
| 0.6576388888888889 | 346.682 |
| 0.6583333333333333 | 342.162 |
| 0.6590277777777778 | 333.113 |
| 0.6597222222222222 | 328.584 |
| 0.6604166666666667 | 324.052 |
| 0.6611111111111111 | 314.98 |
| 0.6618055555555555 | 314.98 |
| 0.6625 | 305.898 |
| 0.6631944444444444 | 301.354 |
| 0.6638888888888889 | 296.808 |
| 0.6645833333333333 | 292.259 |
| 0.6652777777777777 | 283.156 |
| 0.6659722222222222 | 278.603 |
| 0.6666666666666666 | 274.047 |
| 0.6673611111111111 | 269.49 |
| 0.6680555555555556 | 269.49 |
| 0.6687500000000001 | 260.373 |
| 0.6694444444444444 | 260.373 |
| 0.6701388888888888 | 255.813 |
| 0.6708333333333334 | 251.251 |
| 0.6715277777777778 | 246.689 |
| 0.6722222222222222 | 242.127 |
| 0.6729166666666666 | 242.127 |
| 0.6736111111111112 | 237.564 |
| 0.6743055555555556 | 233 |
| 0.6749999999999999 | 228.436 |
| 0.6756944444444444 | 223.873 |
| 0.6763888888888889 | 219.309 |
| 0.6770833333333334 | 219.309 |
| 0.6777777777777777 | 214.746 |
| 0.6784722222222223 | 210.182 |
| 0.6791666666666667 | 210.182 |
| 0.6798611111111111 | 205.62 |
| 0.6805555555555555 | 201.058 |
| 0.68125 | 201.058 |
| 0.6819444444444445 | 196.497 |
| 0.6826388888888889 | 191.937 |
| 0.6833333333333332 | 191.937 |
| 0.6840277777777778 | 187.378 |
| 0.6847222222222222 | 182.82 |
| 0.6854166666666667 | 182.82 |
| 0.686111111111111 | 178.264 |
| 0.6868055555555556 | 178.264 |
| 0.6875 | 178.264 |
| 0.6881944444444444 | 173.709 |
| 0.688888888888889 | 173.709 |
| 0.6895833333333333 | 173.709 |
| 0.6902777777777778 | 169.156 |
| 0.6909722222222222 | 169.156 |
| 0.6916666666666668 | 169.156 |
| 0.6923611111111111 | 164.605 |
| 0.6930555555555555 | 164.605 |
| 0.69375 | 164.605 |
| 0.6944444444444445 | 160.056 |
| 0.6951388888888889 | 160.056 |
| 0.6958333333333333 | 160.056 |
| 0.6965277777777777 | 160.056 |
| 0.6972222222222223 | 155.509 |
| 0.6979166666666666 | 155.509 |
| 0.6986111111111111 | 155.509 |
| 0.6993055555555556 | 150.964 |
| 0.7000000000000001 | 150.964 |
| 0.7006944444444444 | 150.964 |
| 0.7013888888888888 | 146.423 |
| 0.7020833333333334 | 146.423 |
| 0.7027777777777778 | 146.423 |
| 0.7034722222222222 | 141.884 |
| 0.7041666666666666 | 141.884 |
| 0.7048611111111112 | 141.884 |
| 0.7055555555555556 | 141.884 |
| 0.7062499999999999 | 132.814 |
| 0.7069444444444444 | 128.284 |
| 0.7076388888888889 | 123.758 |
| 0.7083333333333334 | 119.235 |
| 0.7090277777777777 | 119.235 |
| 0.7097222222222223 | 119.235 |
| 0.7104166666666667 | 119.235 |
| 0.7111111111111111 | 119.235 |
| 0.7118055555555555 | 119.235 |
| 0.7125 | 119.235 |
| 0.7131944444444445 | 119.235 |
| 0.7138888888888889 | 119.235 |
| 0.7145833333333332 | 114.716 |
| 0.7152777777777778 | 114.716 |
| 0.7159722222222222 | 114.716 |
| 0.7166666666666667 | 114.716 |
| 0.717361111111111 | 114.716 |
| 0.7180555555555556 | 114.716 |
| 0.71875 | 110.201 |
| 0.7194444444444444 | 110.201 |
| 0.720138888888889 | 110.201 |
| 0.7208333333333333 | 110.201 |
| 0.7215277777777778 | 110.201 |
| 0.7222222222222222 | 110.201 |
| 0.7229166666666668 | 110.201 |
| 0.7236111111111111 | 110.201 |
| 0.7243055555555555 | 105.69 |
| 0.725 | 105.69 |
| 0.7256944444444445 | 105.69 |
| 0.7263888888888889 | 105.69 |
| 0.7270833333333333 | 101.184 |
| 0.7277777777777777 | 101.184 |
| 0.7284722222222223 | 101.184 |
| 0.7291666666666666 | 101.184 |
| 0.7298611111111111 | 101.184 |
| 0.7305555555555556 | 101.184 |
| 0.7312500000000001 | 101.184 |
| 0.7319444444444444 | 96.682 |
| 0.7326388888888888 | 96.682 |
| 0.7333333333333334 | 96.682 |
| 0.7340277777777778 | 96.682 |
| 0.7347222222222222 | 92.184 |
| 0.7354166666666666 | 92.184 |
| 0.7361111111111112 | 92.184 |
| 0.7368055555555556 | 92.184 |
| 0.7374999999999999 | 92.184 |
| 0.7381944444444444 | 92.184 |
| 0.7388888888888889 | 92.184 |
| 0.7395833333333334 | 87.692 |
| 0.7402777777777777 | 87.692 |
| 0.7409722222222223 | 87.692 |
| 0.7416666666666667 | 87.692 |
| 0.7423611111111111 | 87.692 |
| 0.7430555555555555 | 87.692 |
| 0.74375 | 87.692 |
| 0.7444444444444445 | 83.205 |
| 0.7451388888888889 | 83.205 |
| 0.7458333333333332 | 83.205 |
| 0.7465277777777778 | 83.205 |
| 0.7472222222222222 | 83.205 |
| 0.7479166666666667 | 83.205 |
| 0.748611111111111 | 83.205 |
| 0.7493055555555556 | 83.205 |
| 0.75 | 78.722 |
| 0.7506944444444444 | 78.722 |
| 0.751388888888889 | 78.722 |
| 0.7520833333333333 | 78.722 |
| 0.7527777777777778 | 78.722 |
| 0.7534722222222222 | 74.246 |
| 0.7541666666666668 | 74.246 |
| 0.7548611111111111 | 74.246 |
| 0.7555555555555555 | 74.246 |
| 0.75625 | 74.246 |
| 0.7569444444444445 | 74.246 |
| 0.7576388888888889 | 74.246 |
| 0.7583333333333333 | 74.246 |
| 0.7590277777777777 | 69.775 |
| 0.7597222222222223 | 69.775 |
| 0.7604166666666666 | 69.775 |
| 0.7611111111111111 | 69.775 |
| 0.7618055555555556 | 65.31 |
| 0.7625000000000001 | 65.31 |
| 0.7631944444444444 | 65.31 |
| 0.7638888888888888 | 65.31 |
| 0.7645833333333334 | 65.31 |
| 0.7652777777777778 | 60.85 |
| 0.7659722222222222 | 60.85 |
| 0.7666666666666666 | 60.85 |
| 0.7673611111111112 | 56.398 |
| 0.7680555555555556 | 56.398 |
| 0.7687499999999999 | 56.398 |
| 0.7694444444444444 | 56.398 |
| 0.7701388888888889 | 56.398 |
| 0.7708333333333334 | 51.951 |
| 0.7715277777777777 | 51.951 |
| 0.7722222222222223 | 51.951 |
| 0.7729166666666667 | 47.511 |
| 0.7736111111111111 | 47.511 |
| 0.7743055555555555 | 47.511 |
| 0.775 | 47.511 |
| 0.7756944444444445 | 43.079 |
| 0.7763888888888889 | 43.079 |
| 0.7770833333333332 | 43.079 |
| 0.7777777777777778 | 43.079 |
| 0.7784722222222222 | 38.653 |
| 0.7791666666666667 | 38.653 |
| 0.779861111111111 | 38.653 |
| 0.7805555555555556 | 38.653 |
| 0.78125 | 38.653 |
| 0.7819444444444444 | 34.234 |
| 0.782638888888889 | 34.234 |
| 0.7833333333333333 | 34.234 |
| 0.7840277777777778 | 34.234 |
| 0.7847222222222222 | 34.234 |
| 0.7854166666666668 | 29.823 |
| 0.7861111111111111 | 29.823 |
| 0.7868055555555555 | 29.823 |
| 0.7875 | 29.823 |
| 0.7881944444444445 | 29.823 |
| 0.7888888888888889 | 25.419 |
| 0.7895833333333333 | 25.419 |
| 0.7902777777777777 | 25.419 |
| 0.7909722222222223 | 25.419 |
| 0.7916666666666666 | 25.419 |
| 0.7923611111111111 | 21.024 |
| 0.7930555555555556 | 21.024 |
| 0.7937500000000001 | 21.024 |
| 0.7944444444444444 | 21.024 |
| 0.7951388888888888 | 21.024 |
| 0.7958333333333334 | 21.024 |
| 0.7965277777777778 | 21.024 |
| 0.7972222222222222 | 21.024 |
| 0.7979166666666666 | 21.024 |
| 0.7986111111111112 | 16.636 |
| 0.7993055555555556 | 16.636 |
| 0.7999999999999999 | 16.636 |
| 0.8006944444444444 | 16.636 |
| 0.8013888888888889 | 12.257 |
| 0.8020833333333334 | 12.257 |
| 0.8027777777777777 | 12.257 |
| 0.8034722222222223 | 12.257 |
| 0.8041666666666667 | 12.257 |
| 0.8048611111111111 | 12.257 |
| 0.8055555555555555 | 12.257 |
| 0.80625 | 7.887 |
| 0.8069444444444445 | 7.887 |
| 0.8076388888888889 | 7.887 |
| 0.8083333333333332 | 7.887 |
| 0.8090277777777778 | 7.887 |
| 0.8097222222222222 | 7.887 |
| 0.8104166666666667 | 3.525 |
| 0.811111111111111 | 3.525 |
| 0.8118055555555556 | 3.525 |
| 0.8125 | 3.525 |
| 0.8131944444444444 | 3.525 |
| 0.813888888888889 | 3.525 |
| 0.8145833333333333 | 3.525 |
| 0.8152777777777778 | 3.525 |
| 0.8159722222222222 | 0 |
| 0.8166666666666668 | 0 |
| 0.8173611111111111 | 0 |
| 0.8180555555555555 | 0 |
| 0.81875 | 0 |
| 0.8194444444444445 | 0 |
| 0.8201388888888889 | 0 |
| 0.8208333333333333 | 0 |
| 0.8215277777777777 | 0 |
| 0.8222222222222223 | 0 |
| 0.8229166666666666 | 0 |
| 0.8236111111111111 | 0 |
| 0.8243055555555556 | 0 |
| 0.8250000000000001 | 0 |
| 0.8256944444444444 | 0 |
| 0.8263888888888888 | 0 |
| 0.8270833333333334 | 0 |
| 0.8277777777777778 | 0 |
| 0.8284722222222222 | 0 |
| 0.8291666666666666 | 0 |
| 0.8298611111111112 | 0 |
| 0.8305555555555556 | 0 |
| 0.8312499999999999 | 0 |
| 0.8319444444444444 | 0 |
| 0.8326388888888889 | 0 |
| 0.8333333333333334 | 0 |
| 0.8340277777777777 | 0 |
| 0.8347222222222223 | 0 |
| 0.8354166666666667 | 0 |
| 0.8361111111111111 | 0 |
| 0.8368055555555555 | 0 |
| 0.8375 | 0 |
| 0.8381944444444445 | 0 |
| 0.8388888888888889 | 0 |
| 0.8395833333333332 | 0 |
| 0.8402777777777778 | 0 |
| 0.8409722222222222 | 0 |
| 0.8416666666666667 | 0 |
| 0.842361111111111 | 0 |
| 0.8430555555555556 | 0 |
| 0.84375 | 0 |
| 0.8444444444444444 | 0 |
| 0.845138888888889 | 0 |
| 0.8458333333333333 | 0 |
| 0.8465277777777778 | 0 |
| 0.8472222222222222 | 0 |
| 0.8479166666666668 | 0 |
| 0.8486111111111111 | 0 |
| 0.8493055555555555 | 0 |
| 0.85 | 0 |
| 0.8506944444444445 | 0 |
| 0.8513888888888889 | 0 |
| 0.8520833333333333 | 0 |
| 0.8527777777777777 | 0 |
| 0.8534722222222223 | 0 |
| 0.8541666666666666 | 0 |
| 0.8548611111111111 | 0 |
| 0.8555555555555556 | 0 |
| 0.8562500000000001 | 0 |
| 0.8569444444444444 | 0 |
| 0.8576388888888888 | 0 |
| 0.8583333333333334 | 0 |
| 0.8590277777777778 | 0 |
| 0.8597222222222222 | 0 |
| 0.8604166666666666 | 0 |
| 0.8611111111111112 | 0 |
| 0.8618055555555556 | 0 |
| 0.8624999999999999 | 0 |
| 0.8631944444444444 | 0 |
| 0.8638888888888889 | 0 |
| 0.8645833333333334 | 0 |
| 0.8652777777777777 | 0 |
| 0.8659722222222223 | 0 |
| 0.8666666666666667 | 0 |
| 0.8673611111111111 | 0 |
| 0.8680555555555555 | 0 |
| 0.86875 | 0 |
| 0.8694444444444445 | 0 |
| 0.8701388888888889 | 0 |
| 0.8708333333333332 | 0 |
| 0.8715277777777778 | 0 |
| 0.8722222222222222 | 0 |
| 0.8729166666666667 | 0 |
| 0.873611111111111 | 0 |
| 0.8743055555555556 | 0 |
| 0.875 | 0 |
| 0.8756944444444444 | 0 |
| 0.876388888888889 | 0 |
| 0.8770833333333333 | 0 |
| 0.8777777777777778 | 0 |
| 0.8784722222222222 | 0 |
| 0.8791666666666668 | 0 |
| 0.8798611111111111 | 0 |
| 0.8805555555555555 | 0 |
| 0.88125 | 0 |
| 0.8819444444444445 | 0 |
| 0.8826388888888889 | 0 |
| 0.8833333333333333 | 0 |
| 0.8840277777777777 | 0 |
| 0.8847222222222223 | 0 |
| 0.8854166666666666 | 0 |
| 0.8861111111111111 | 0 |
| 0.8868055555555556 | 0 |
| 0.8875000000000001 | 0 |
| 0.8881944444444444 | 0 |
| 0.8888888888888888 | 0 |
| 0.8895833333333334 | 0 |
| 0.8902777777777778 | 0 |
| 0.8909722222222222 | 0 |
| 0.8916666666666666 | 0 |
| 0.8923611111111112 | 0 |
| 0.8930555555555556 | 0 |
| 0.8937499999999999 | 0 |
| 0.8944444444444444 | 0 |
| 0.8951388888888889 | 0 |
| 0.8958333333333334 | 0 |
| 0.8965277777777777 | 0 |
| 0.8972222222222223 | 0 |
| 0.8979166666666667 | 0 |
| 0.8986111111111111 | 0 |
| 0.8993055555555555 | 0 |
| 0.9 | 0 |
| 0.9006944444444445 | 0 |
| 0.9013888888888889 | 0 |
| 0.9020833333333332 | 0 |
| 0.9027777777777778 | 0 |
| 0.9034722222222222 | 0 |
| 0.9041666666666667 | 0 |
| 0.904861111111111 | 0 |
| 0.9055555555555556 | 0 |
| 0.90625 | 0 |
| 0.9069444444444444 | 0 |
| 0.907638888888889 | 0 |
| 0.9083333333333333 | 0 |
| 0.9090277777777778 | 0 |
| 0.9097222222222222 | 0 |
| 0.9104166666666668 | 0 |
| 0.9111111111111111 | 0 |
| 0.9118055555555555 | 0 |
| 0.9125 | 0 |
| 0.9131944444444445 | 0 |
| 0.9138888888888889 | 0 |
| 0.9145833333333333 | 0 |
| 0.9152777777777777 | 0 |
| 0.9159722222222223 | 0 |
| 0.9166666666666666 | 0 |
| 0.9173611111111111 | 0 |
| 0.9180555555555556 | 0 |
| 0.9187500000000001 | 0 |
| 0.9194444444444444 | 0 |
| 0.9201388888888888 | 0 |
| 0.9208333333333334 | 0 |
| 0.9215277777777778 | 0 |
| 0.9222222222222222 | 0 |
| 0.9229166666666666 | 0 |
| 0.9236111111111112 | 0 |
| 0.9243055555555556 | 0 |
| 0.9249999999999999 | 0 |
| 0.9256944444444444 | 0 |
| 0.9263888888888889 | 0 |
| 0.9270833333333334 | 0 |
| 0.9277777777777777 | 0 |
| 0.9284722222222223 | 0 |
| 0.9291666666666667 | 0 |
| 0.9298611111111111 | 0 |
| 0.9305555555555555 | 0 |
| 0.93125 | 0 |
| 0.9319444444444445 | 0 |
| 0.9326388888888889 | 0 |
| 0.9333333333333332 | 0 |
| 0.9340277777777778 | 0 |
| 0.9347222222222222 | 0 |
| 0.9354166666666667 | 0 |
| 0.936111111111111 | 0 |
| 0.9368055555555556 | 0 |
| 0.9375 | 0 |
| 0.9381944444444444 | 0 |
| 0.938888888888889 | 0 |
| 0.9395833333333333 | 0 |
| 0.9402777777777778 | 0 |
| 0.9409722222222222 | 0 |
| 0.9416666666666668 | 0 |
| 0.9423611111111111 | 0 |
| 0.9430555555555555 | 0 |
| 0.94375 | 0 |
| 0.9444444444444445 | 0 |
| 0.9451388888888889 | 0 |
| 0.9458333333333333 | 0 |
| 0.9465277777777777 | 0 |
| 0.9472222222222223 | 0 |
| 0.9479166666666666 | 0 |
| 0.9486111111111111 | 0 |
| 0.9493055555555556 | 0 |
| 0.9500000000000001 | 0 |
| 0.9506944444444444 | 0 |
| 0.9513888888888888 | 0 |
| 0.9520833333333334 | 0 |
| 0.9527777777777778 | 0 |
| 0.9534722222222222 | 0 |
| 0.9541666666666666 | 0 |
| 0.9548611111111112 | 0 |
| 0.9555555555555556 | 0 |
| 0.9562499999999999 | 0 |
| 0.9569444444444444 | 0 |
| 0.9576388888888889 | 0 |
| 0.9583333333333334 | 0 |
| 0.9590277777777777 | 0 |
| 0.9597222222222223 | 0 |
| 0.9604166666666667 | 0 |
| 0.9611111111111111 | 0 |
| 0.9618055555555555 | 0 |
| 0.9625 | 0 |
| 0.9631944444444445 | 0 |
| 0.9638888888888889 | 0 |
| 0.9645833333333332 | 0 |
| 0.9652777777777778 | 0 |
| 0.9659722222222222 | 0 |
| 0.9666666666666667 | 0 |
| 0.967361111111111 | 0 |
| 0.9680555555555556 | 0 |
| 0.96875 | 0 |
| 0.9694444444444444 | 0 |
| 0.970138888888889 | 0 |
| 0.9708333333333333 | 0 |
| 0.9715277777777778 | 0 |
| 0.9722222222222222 | 0 |
| 0.9729166666666668 | 0 |
| 0.9736111111111111 | 0 |
| 0.9743055555555555 | 0 |
| 0.975 | 0 |
| 0.9756944444444445 | 0 |
| 0.9763888888888889 | 0 |
| 0.9770833333333333 | 0 |
| 0.9777777777777777 | 0 |
| 0.9784722222222223 | 0 |
| 0.9791666666666666 | 0 |
| 0.9798611111111111 | 0 |
| 0.9805555555555556 | 0 |
| 0.9812500000000001 | 0 |
| 0.9819444444444444 | 0 |
| 0.9826388888888888 | 0 |
| 0.9833333333333334 | 0 |
| 0.9840277777777778 | 0 |
| 0.9847222222222222 | 0 |
| 0.9854166666666666 | 0 |
| 0.9861111111111112 | 0 |
| 0.9868055555555556 | 0 |
| 0.9874999999999999 | 0 |
| 0.9881944444444444 | 0 |
| 0.9888888888888889 | 0 |
| 0.9895833333333334 | 0 |
| 0.9902777777777777 | 0 |
| 0.9909722222222223 | 0 |
| 0.9916666666666667 | 0 |
| 0.9923611111111111 | 0 |
| 0.9930555555555555 | 0 |
| 0.99375 | 0 |
| 0.9944444444444445 | 0 |
| 0.9951388888888889 | 0 |
| 0.9958333333333332 | 0 |
| 0.9965277777777778 | 0 |
| 0.9972222222222222 | 0 |
| 0.9979166666666667 | 0 |
| 0.998611111111111 | 0 |
| 0.9993055555555556 | 0 |